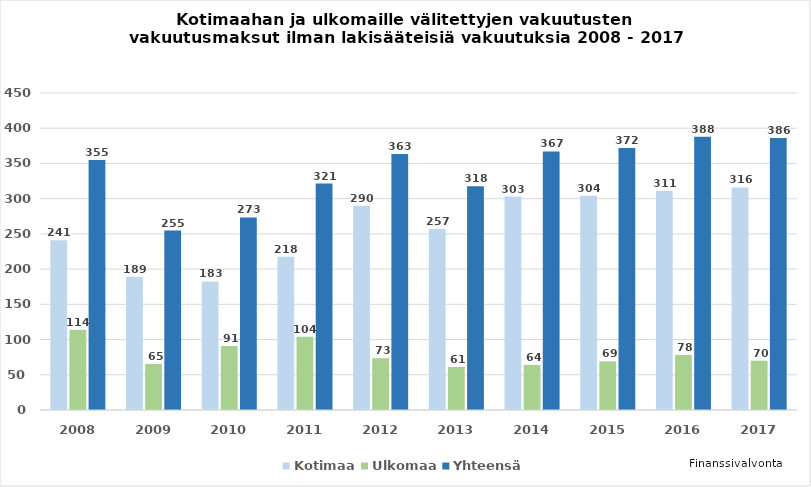
| Category | Kotimaa | Ulkomaa | Yhteensä  |
|---|---|---|---|
| 2008.0 | 241 | 114 | 355 |
| 2009.0 | 189.249 | 65.417 | 254.666 |
| 2010.0 | 182.562 | 90.729 | 273.291 |
| 2011.0 | 217.55 | 103.894 | 321.444 |
| 2012.0 | 289.922 | 73.321 | 363.243 |
| 2013.0 | 257 | 61 | 317.523 |
| 2014.0 | 303 | 64 | 367 |
| 2015.0 | 304 | 69 | 372 |
| 2016.0 | 311 | 78 | 388 |
| 2017.0 | 316 | 70 | 386 |